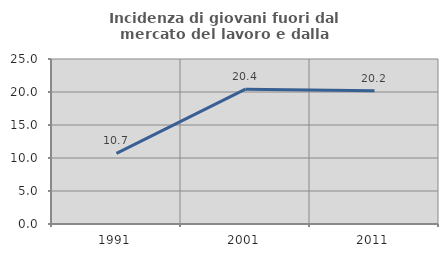
| Category | Incidenza di giovani fuori dal mercato del lavoro e dalla formazione  |
|---|---|
| 1991.0 | 10.687 |
| 2001.0 | 20.43 |
| 2011.0 | 20.192 |